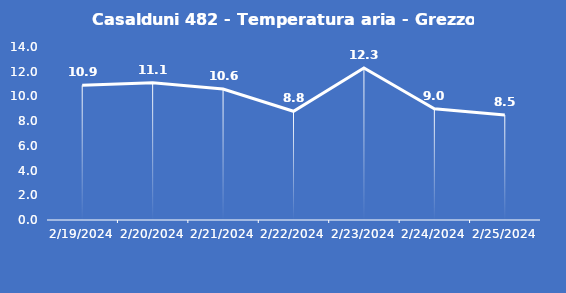
| Category | Casalduni 482 - Temperatura aria - Grezzo (°C) |
|---|---|
| 2/19/24 | 10.9 |
| 2/20/24 | 11.1 |
| 2/21/24 | 10.6 |
| 2/22/24 | 8.8 |
| 2/23/24 | 12.3 |
| 2/24/24 | 9 |
| 2/25/24 | 8.5 |